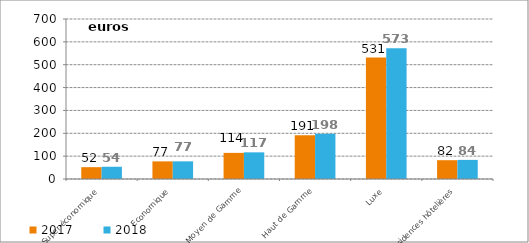
| Category | 2017 | 2018 |
|---|---|---|
| Super-économique | 51.714 | 53.56 |
| Economique | 77.11 | 77.243 |
| Moyen de Gamme | 114.252 | 116.648 |
| Haut de Gamme | 191.477 | 198.432 |
| Luxe | 531.154 | 572.522 |
| Résidences hôtelières | 82.211 | 83.609 |